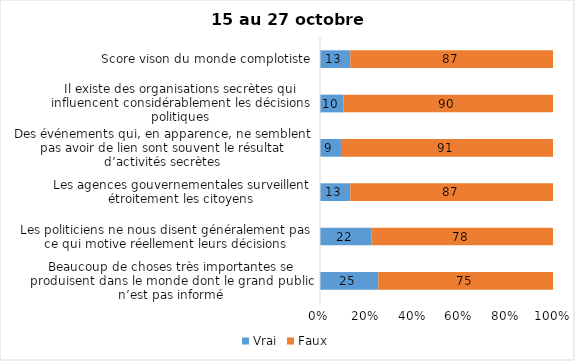
| Category | Vrai | Faux |
|---|---|---|
| Beaucoup de choses très importantes se produisent dans le monde dont le grand public n’est pas informé | 25 | 75 |
| Les politiciens ne nous disent généralement pas ce qui motive réellement leurs décisions | 22 | 78 |
| Les agences gouvernementales surveillent étroitement les citoyens | 13 | 87 |
| Des événements qui, en apparence, ne semblent pas avoir de lien sont souvent le résultat d’activités secrètes | 9 | 91 |
| Il existe des organisations secrètes qui influencent considérablement les décisions politiques | 10 | 90 |
| Score vison du monde complotiste | 13 | 87 |